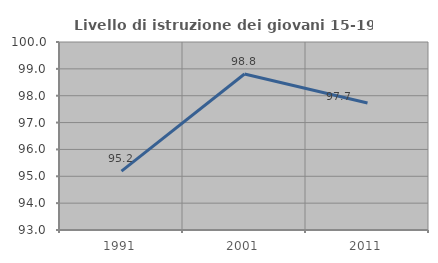
| Category | Livello di istruzione dei giovani 15-19 anni |
|---|---|
| 1991.0 | 95.192 |
| 2001.0 | 98.81 |
| 2011.0 | 97.727 |